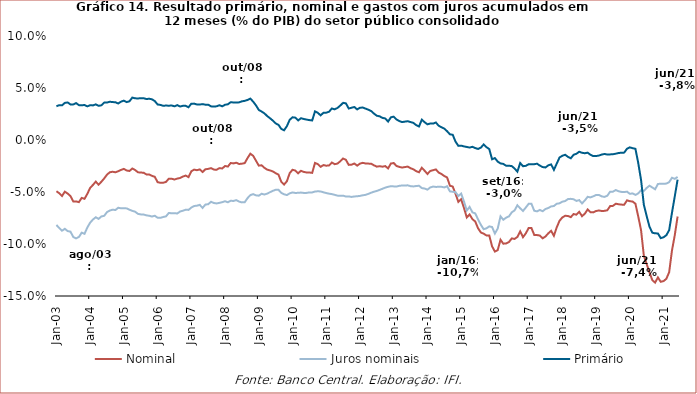
| Category | Nominal | Juros nominais | Primário |
|---|---|---|---|
| 2003-01-01 | -0.049 | -0.082 | 0.032 |
| 2003-02-01 | -0.051 | -0.085 | 0.034 |
| 2003-03-01 | -0.054 | -0.087 | 0.033 |
| 2003-04-01 | -0.05 | -0.085 | 0.036 |
| 2003-05-01 | -0.051 | -0.088 | 0.036 |
| 2003-06-01 | -0.054 | -0.088 | 0.034 |
| 2003-07-01 | -0.059 | -0.093 | 0.034 |
| 2003-08-01 | -0.059 | -0.095 | 0.036 |
| 2003-09-01 | -0.06 | -0.093 | 0.034 |
| 2003-10-01 | -0.056 | -0.089 | 0.033 |
| 2003-11-01 | -0.057 | -0.09 | 0.034 |
| 2003-12-01 | -0.052 | -0.084 | 0.032 |
| 2004-01-01 | -0.046 | -0.079 | 0.033 |
| 2004-02-01 | -0.043 | -0.076 | 0.033 |
| 2004-03-01 | -0.04 | -0.074 | 0.034 |
| 2004-04-01 | -0.043 | -0.076 | 0.033 |
| 2004-05-01 | -0.04 | -0.073 | 0.033 |
| 2004-06-01 | -0.037 | -0.073 | 0.036 |
| 2004-07-01 | -0.033 | -0.069 | 0.036 |
| 2004-08-01 | -0.031 | -0.068 | 0.037 |
| 2004-09-01 | -0.031 | -0.067 | 0.036 |
| 2004-10-01 | -0.031 | -0.067 | 0.036 |
| 2004-11-01 | -0.03 | -0.065 | 0.035 |
| 2004-12-01 | -0.029 | -0.066 | 0.037 |
| 2005-01-01 | -0.028 | -0.066 | 0.038 |
| 2005-02-01 | -0.029 | -0.066 | 0.036 |
| 2005-03-01 | -0.03 | -0.067 | 0.037 |
| 2005-04-01 | -0.027 | -0.068 | 0.041 |
| 2005-05-01 | -0.029 | -0.069 | 0.04 |
| 2005-06-01 | -0.031 | -0.071 | 0.04 |
| 2005-07-01 | -0.031 | -0.072 | 0.04 |
| 2005-08-01 | -0.031 | -0.072 | 0.04 |
| 2005-09-01 | -0.033 | -0.072 | 0.039 |
| 2005-10-01 | -0.033 | -0.073 | 0.04 |
| 2005-11-01 | -0.034 | -0.074 | 0.039 |
| 2005-12-01 | -0.035 | -0.073 | 0.037 |
| 2006-01-01 | -0.041 | -0.075 | 0.034 |
| 2006-02-01 | -0.041 | -0.075 | 0.034 |
| 2006-03-01 | -0.041 | -0.074 | 0.033 |
| 2006-04-01 | -0.04 | -0.073 | 0.033 |
| 2006-05-01 | -0.037 | -0.07 | 0.033 |
| 2006-06-01 | -0.037 | -0.07 | 0.033 |
| 2006-07-01 | -0.038 | -0.07 | 0.032 |
| 2006-08-01 | -0.037 | -0.071 | 0.034 |
| 2006-09-01 | -0.037 | -0.069 | 0.032 |
| 2006-10-01 | -0.035 | -0.068 | 0.033 |
| 2006-11-01 | -0.034 | -0.067 | 0.033 |
| 2006-12-01 | -0.036 | -0.067 | 0.032 |
| 2007-01-01 | -0.03 | -0.065 | 0.035 |
| 2007-02-01 | -0.028 | -0.063 | 0.035 |
| 2007-03-01 | -0.029 | -0.063 | 0.034 |
| 2007-04-01 | -0.028 | -0.062 | 0.034 |
| 2007-05-01 | -0.031 | -0.065 | 0.035 |
| 2007-06-01 | -0.028 | -0.062 | 0.034 |
| 2007-07-01 | -0.028 | -0.062 | 0.034 |
| 2007-08-01 | -0.027 | -0.059 | 0.032 |
| 2007-09-01 | -0.028 | -0.061 | 0.032 |
| 2007-10-01 | -0.029 | -0.061 | 0.032 |
| 2007-11-01 | -0.027 | -0.06 | 0.033 |
| 2007-12-01 | -0.027 | -0.06 | 0.032 |
| 2008-01-01 | -0.025 | -0.059 | 0.034 |
| 2008-02-01 | -0.026 | -0.06 | 0.034 |
| 2008-03-01 | -0.022 | -0.058 | 0.036 |
| 2008-04-01 | -0.022 | -0.059 | 0.036 |
| 2008-05-01 | -0.022 | -0.058 | 0.036 |
| 2008-06-01 | -0.023 | -0.059 | 0.036 |
| 2008-07-01 | -0.023 | -0.06 | 0.037 |
| 2008-08-01 | -0.022 | -0.06 | 0.038 |
| 2008-09-01 | -0.017 | -0.056 | 0.039 |
| 2008-10-01 | -0.013 | -0.053 | 0.04 |
| 2008-11-01 | -0.015 | -0.052 | 0.037 |
| 2008-12-01 | -0.02 | -0.053 | 0.033 |
| 2009-01-01 | -0.025 | -0.054 | 0.029 |
| 2009-02-01 | -0.024 | -0.052 | 0.027 |
| 2009-03-01 | -0.027 | -0.052 | 0.026 |
| 2009-04-01 | -0.029 | -0.052 | 0.023 |
| 2009-05-01 | -0.029 | -0.05 | 0.021 |
| 2009-06-01 | -0.03 | -0.049 | 0.019 |
| 2009-07-01 | -0.032 | -0.048 | 0.016 |
| 2009-08-01 | -0.033 | -0.048 | 0.015 |
| 2009-09-01 | -0.04 | -0.051 | 0.011 |
| 2009-10-01 | -0.043 | -0.052 | 0.009 |
| 2009-11-01 | -0.04 | -0.053 | 0.013 |
| 2009-12-01 | -0.032 | -0.051 | 0.019 |
| 2010-01-01 | -0.029 | -0.05 | 0.022 |
| 2010-02-01 | -0.029 | -0.051 | 0.022 |
| 2010-03-01 | -0.032 | -0.051 | 0.019 |
| 2010-04-01 | -0.03 | -0.051 | 0.021 |
| 2010-05-01 | -0.031 | -0.051 | 0.02 |
| 2010-06-01 | -0.031 | -0.051 | 0.02 |
| 2010-07-01 | -0.031 | -0.05 | 0.019 |
| 2010-08-01 | -0.032 | -0.05 | 0.019 |
| 2010-09-01 | -0.022 | -0.05 | 0.028 |
| 2010-10-01 | -0.023 | -0.049 | 0.026 |
| 2010-11-01 | -0.026 | -0.049 | 0.024 |
| 2010-12-01 | -0.024 | -0.05 | 0.026 |
| 2011-01-01 | -0.025 | -0.051 | 0.026 |
| 2011-02-01 | -0.024 | -0.052 | 0.027 |
| 2011-03-01 | -0.022 | -0.052 | 0.03 |
| 2011-04-01 | -0.023 | -0.053 | 0.029 |
| 2011-05-01 | -0.023 | -0.053 | 0.031 |
| 2011-06-01 | -0.02 | -0.054 | 0.033 |
| 2011-07-01 | -0.018 | -0.054 | 0.036 |
| 2011-08-01 | -0.019 | -0.054 | 0.035 |
| 2011-09-01 | -0.024 | -0.054 | 0.03 |
| 2011-10-01 | -0.024 | -0.055 | 0.031 |
| 2011-11-01 | -0.023 | -0.054 | 0.032 |
| 2011-12-01 | -0.025 | -0.054 | 0.029 |
| 2012-01-01 | -0.023 | -0.054 | 0.031 |
| 2012-02-01 | -0.022 | -0.053 | 0.031 |
| 2012-03-01 | -0.023 | -0.053 | 0.03 |
| 2012-04-01 | -0.023 | -0.052 | 0.029 |
| 2012-05-01 | -0.023 | -0.051 | 0.028 |
| 2012-06-01 | -0.024 | -0.05 | 0.025 |
| 2012-07-01 | -0.026 | -0.049 | 0.023 |
| 2012-08-01 | -0.025 | -0.048 | 0.023 |
| 2012-09-01 | -0.026 | -0.047 | 0.021 |
| 2012-10-01 | -0.025 | -0.046 | 0.021 |
| 2012-11-01 | -0.027 | -0.045 | 0.018 |
| 2012-12-01 | -0.023 | -0.044 | 0.022 |
| 2013-01-01 | -0.022 | -0.045 | 0.022 |
| 2013-02-01 | -0.025 | -0.045 | 0.02 |
| 2013-03-01 | -0.026 | -0.044 | 0.018 |
| 2013-04-01 | -0.027 | -0.044 | 0.017 |
| 2013-05-01 | -0.026 | -0.044 | 0.018 |
| 2013-06-01 | -0.026 | -0.044 | 0.018 |
| 2013-07-01 | -0.027 | -0.044 | 0.017 |
| 2013-08-01 | -0.028 | -0.045 | 0.016 |
| 2013-09-01 | -0.03 | -0.044 | 0.014 |
| 2013-10-01 | -0.031 | -0.044 | 0.013 |
| 2013-11-01 | -0.027 | -0.046 | 0.02 |
| 2013-12-01 | -0.03 | -0.047 | 0.017 |
| 2014-01-01 | -0.033 | -0.048 | 0.015 |
| 2014-02-01 | -0.03 | -0.046 | 0.016 |
| 2014-03-01 | -0.029 | -0.045 | 0.016 |
| 2014-04-01 | -0.028 | -0.045 | 0.017 |
| 2014-05-01 | -0.031 | -0.045 | 0.014 |
| 2014-06-01 | -0.033 | -0.045 | 0.012 |
| 2014-07-01 | -0.035 | -0.046 | 0.011 |
| 2014-08-01 | -0.036 | -0.044 | 0.008 |
| 2014-09-01 | -0.044 | -0.049 | 0.005 |
| 2014-10-01 | -0.045 | -0.05 | 0.005 |
| 2014-11-01 | -0.052 | -0.05 | -0.002 |
| 2014-12-01 | -0.06 | -0.054 | -0.006 |
| 2015-01-01 | -0.057 | -0.052 | -0.005 |
| 2015-02-01 | -0.065 | -0.059 | -0.006 |
| 2015-03-01 | -0.074 | -0.068 | -0.007 |
| 2015-04-01 | -0.072 | -0.064 | -0.007 |
| 2015-05-01 | -0.076 | -0.07 | -0.007 |
| 2015-06-01 | -0.078 | -0.071 | -0.008 |
| 2015-07-01 | -0.085 | -0.076 | -0.009 |
| 2015-08-01 | -0.089 | -0.082 | -0.007 |
| 2015-09-01 | -0.09 | -0.086 | -0.004 |
| 2015-10-01 | -0.092 | -0.085 | -0.007 |
| 2015-11-01 | -0.092 | -0.083 | -0.009 |
| 2015-12-01 | -0.102 | -0.084 | -0.019 |
| 2016-01-01 | -0.107 | -0.09 | -0.017 |
| 2016-02-01 | -0.106 | -0.085 | -0.021 |
| 2016-03-01 | -0.096 | -0.073 | -0.023 |
| 2016-04-01 | -0.1 | -0.077 | -0.023 |
| 2016-05-01 | -0.099 | -0.075 | -0.025 |
| 2016-06-01 | -0.098 | -0.073 | -0.025 |
| 2016-07-01 | -0.095 | -0.07 | -0.025 |
| 2016-08-01 | -0.095 | -0.068 | -0.027 |
| 2016-09-01 | -0.093 | -0.063 | -0.03 |
| 2016-10-01 | -0.088 | -0.066 | -0.022 |
| 2016-11-01 | -0.093 | -0.068 | -0.025 |
| 2016-12-01 | -0.09 | -0.065 | -0.025 |
| 2017-01-01 | -0.085 | -0.061 | -0.023 |
| 2017-02-01 | -0.085 | -0.061 | -0.023 |
| 2017-03-01 | -0.091 | -0.068 | -0.023 |
| 2017-04-01 | -0.091 | -0.069 | -0.023 |
| 2017-05-01 | -0.092 | -0.067 | -0.025 |
| 2017-06-01 | -0.095 | -0.069 | -0.026 |
| 2017-07-01 | -0.093 | -0.066 | -0.026 |
| 2017-08-01 | -0.09 | -0.065 | -0.024 |
| 2017-09-01 | -0.087 | -0.064 | -0.023 |
| 2017-10-01 | -0.092 | -0.063 | -0.029 |
| 2017-11-01 | -0.084 | -0.061 | -0.023 |
| 2017-12-01 | -0.078 | -0.061 | -0.017 |
| 2018-01-01 | -0.074 | -0.059 | -0.015 |
| 2018-02-01 | -0.073 | -0.059 | -0.014 |
| 2018-03-01 | -0.073 | -0.057 | -0.016 |
| 2018-04-01 | -0.074 | -0.057 | -0.018 |
| 2018-05-01 | -0.071 | -0.057 | -0.014 |
| 2018-06-01 | -0.072 | -0.059 | -0.013 |
| 2018-07-01 | -0.069 | -0.058 | -0.011 |
| 2018-08-01 | -0.073 | -0.061 | -0.012 |
| 2018-09-01 | -0.071 | -0.058 | -0.013 |
| 2018-10-01 | -0.067 | -0.055 | -0.012 |
| 2018-11-01 | -0.069 | -0.055 | -0.014 |
| 2018-12-01 | -0.07 | -0.054 | -0.015 |
| 2019-01-01 | -0.068 | -0.053 | -0.015 |
| 2019-02-01 | -0.068 | -0.053 | -0.015 |
| 2019-03-01 | -0.068 | -0.054 | -0.014 |
| 2019-04-01 | -0.068 | -0.055 | -0.013 |
| 2019-05-01 | -0.068 | -0.054 | -0.014 |
| 2019-06-01 | -0.064 | -0.05 | -0.014 |
| 2019-07-01 | -0.063 | -0.05 | -0.014 |
| 2019-08-01 | -0.061 | -0.048 | -0.013 |
| 2019-09-01 | -0.062 | -0.049 | -0.013 |
| 2019-10-01 | -0.062 | -0.05 | -0.012 |
| 2019-11-01 | -0.062 | -0.05 | -0.012 |
| 2019-12-01 | -0.058 | -0.05 | -0.008 |
| 2020-01-01 | -0.059 | -0.052 | -0.007 |
| 2020-02-01 | -0.059 | -0.051 | -0.008 |
| 2020-03-01 | -0.061 | -0.053 | -0.008 |
| 2020-04-01 | -0.074 | -0.051 | -0.022 |
| 2020-05-01 | -0.087 | -0.048 | -0.038 |
| 2020-06-01 | -0.111 | -0.049 | -0.062 |
| 2020-07-01 | -0.119 | -0.046 | -0.073 |
| 2020-08-01 | -0.127 | -0.044 | -0.083 |
| 2020-09-01 | -0.135 | -0.046 | -0.089 |
| 2020-10-01 | -0.137 | -0.047 | -0.09 |
| 2020-11-01 | -0.132 | -0.042 | -0.09 |
| 2020-12-01 | -0.136 | -0.042 | -0.094 |
| 2021-01-01 | -0.136 | -0.042 | -0.094 |
| 2021-02-01 | -0.133 | -0.042 | -0.092 |
| 2021-03-01 | -0.127 | -0.041 | -0.087 |
| 2021-04-01 | -0.106 | -0.036 | -0.07 |
| 2021-05-01 | -0.091 | -0.037 | -0.054 |
| 2021-06-01 | -0.074 | -0.035 | -0.038 |